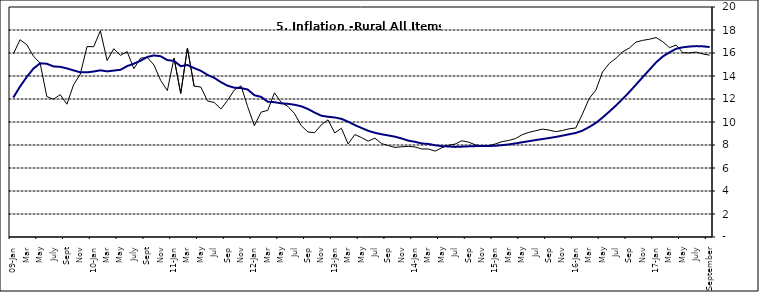
| Category | Year-on Rate | 12-Month Average |
|---|---|---|
| 09-Jan | 15.918 | 12.128 |
| Feb | 17.154 | 13.086 |
| Mar | 16.729 | 13.912 |
| Apr | 15.727 | 14.644 |
| May | 15.113 | 15.104 |
| June | 12.213 | 15.067 |
| July | 11.974 | 14.832 |
| Aug | 12.38 | 14.796 |
| Sept | 11.548 | 14.661 |
| Oct | 13.242 | 14.488 |
| Nov | 14.164 | 14.321 |
|  | 16.557 | 14.316 |
| 10-Jan | 16.548 | 14.39 |
| Feb | 17.934 | 14.494 |
| Mar | 15.346 | 14.401 |
| Apr | 16.373 | 14.473 |
| May | 15.794 | 14.54 |
| June | 16.126 | 14.862 |
| July | 14.634 | 15.072 |
| Aug | 15.556 | 15.33 |
| Sept | 15.616 | 15.658 |
| Oct | 14.955 | 15.786 |
| Nov | 13.616 | 15.719 |
| Dec | 12.735 | 15.385 |
| 11-Jan | 15.553 | 15.311 |
| Feb | 12.482 | 14.856 |
| Mar | 16.422 | 14.956 |
| Apr | 13.117 | 14.687 |
| May | 13.041 | 14.457 |
| Jun | 11.83 | 14.095 |
| Jul | 11.699 | 13.84 |
| Aug | 11.13 | 13.464 |
| Sep | 11.878 | 13.156 |
| Oct | 12.778 | 12.985 |
| Nov | 13.147 | 12.95 |
| Dec | 11.326 | 12.824 |
| 12-Jan | 9.678 | 12.33 |
| Feb | 10.856 | 12.188 |
| Mar | 11.014 | 11.76 |
| Apr | 12.536 | 11.724 |
| May | 11.712 | 11.621 |
| Jun | 11.36 | 11.582 |
| Jul | 10.733 | 11.499 |
| Aug | 9.683 | 11.368 |
| Sep | 9.132 | 11.131 |
| Oct | 9.071 | 10.82 |
| Nov | 9.758 | 10.548 |
| Dec | 10.183 | 10.455 |
| 13-Jan | 9.052 | 10.394 |
| Feb | 9.457 | 10.276 |
| Mar | 8.091 | 10.025 |
| Apr | 8.907 | 9.732 |
| May | 8.647 | 9.483 |
| Jun | 8.333 | 9.236 |
| Jul | 8.6 | 9.063 |
| Aug | 8.12 | 8.933 |
| Sep | 7.95 | 8.832 |
| Oct | 7.791 | 8.722 |
| Nov | 7.849 | 8.565 |
| Dec | 7.879 | 8.378 |
| 14-Jan | 7.832 | 8.277 |
| Feb | 7.657 | 8.13 |
| Mar | 7.65 | 8.092 |
| Apr | 7.473 | 7.973 |
| May | 7.761 | 7.901 |
| Jun | 7.98 | 7.874 |
| Jul | 8.086 | 7.834 |
| Aug | 8.368 | 7.858 |
| Sep | 8.244 | 7.883 |
| Oct | 8.019 | 7.903 |
| Nov | 7.898 | 7.906 |
| Dec | 7.955 | 7.913 |
| 15-Jan | 8.094 | 7.935 |
| Feb | 8.291 | 7.988 |
| Mar | 8.396 | 8.05 |
| Apr | 8.556 | 8.14 |
| May | 8.896 | 8.236 |
| Jun | 9.098 | 8.331 |
| Jul | 9.238 | 8.429 |
| Aug | 9.382 | 8.516 |
| Sep | 9.3 | 8.606 |
| Oct | 9.162 | 8.7 |
| Nov | 9.261 | 8.813 |
| Dec | 9.41 | 8.933 |
| 16-Jan | 9.48 | 9.047 |
| Feb | 10.692 | 9.249 |
| Mar | 12.038 | 9.559 |
| Apr | 12.767 | 9.917 |
| May | 14.349 | 10.384 |
| Jun | 15.088 | 10.897 |
| Jul | 15.533 | 11.433 |
| Aug | 16.103 | 12.002 |
| Sep | 16.428 | 12.601 |
| Oct | 16.947 | 13.25 |
| Nov | 17.099 | 13.898 |
| Dec | 17.195 | 14.54 |
| 17-Jan | 17.341 | 15.183 |
| Feb | 16.982 | 15.696 |
| Mar | 16.466 | 16.054 |
| Apr | 16.687 | 16.369 |
| May | 16.023 | 16.497 |
| June | 16.007 | 16.563 |
| July | 16.078 | 16.6 |
| August | 15.914 | 16.577 |
| September | 15.812 | 16.52 |